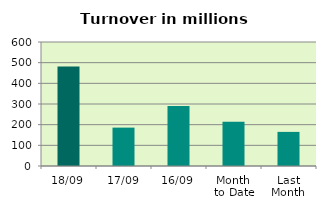
| Category | Series 0 |
|---|---|
| 18/09 | 481.539 |
| 17/09 | 185.737 |
| 16/09 | 290.021 |
| Month 
to Date | 214.324 |
| Last
Month | 165.075 |